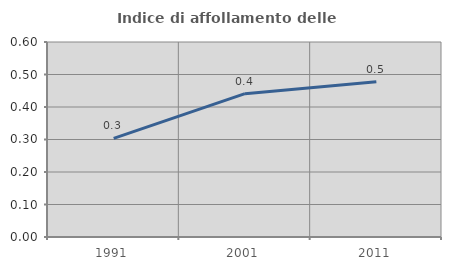
| Category | Indice di affollamento delle abitazioni  |
|---|---|
| 1991.0 | 0.303 |
| 2001.0 | 0.441 |
| 2011.0 | 0.478 |